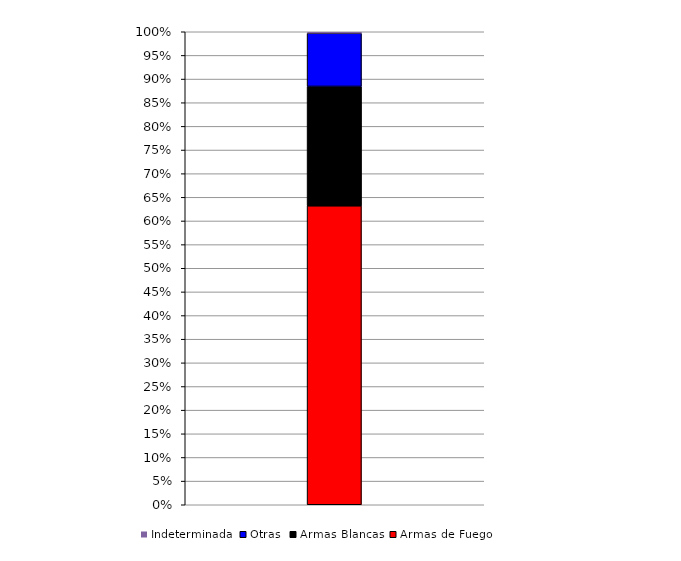
| Category | Armas de Fuego | Armas Blancas | Otras | Indeterminada |
|---|---|---|---|---|
|  | 1247 | 498 | 222 | 6 |